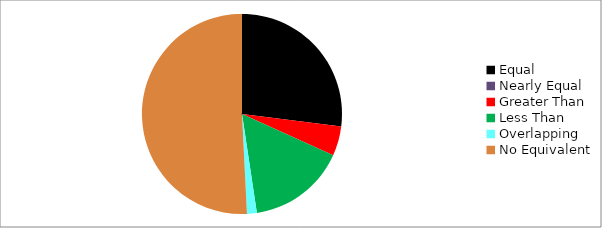
| Category | Series 0 |
|---|---|
| Equal | 17 |
| Nearly Equal | 0 |
| Greater Than | 3 |
| Less Than | 10 |
| Overlapping | 1 |
| No Equivalent | 32 |